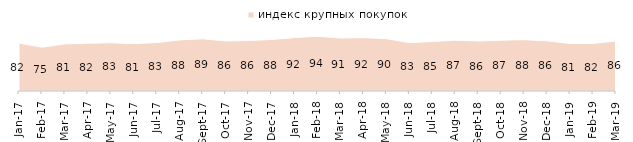
| Category | индекс крупных покупок |
|---|---|
| 2017-01-01 | 82.1 |
| 2017-02-01 | 75.05 |
| 2017-03-01 | 80.8 |
| 2017-04-01 | 81.9 |
| 2017-05-01 | 82.65 |
| 2017-06-01 | 81.15 |
| 2017-07-01 | 82.95 |
| 2017-08-01 | 87.6 |
| 2017-09-01 | 89.45 |
| 2017-10-01 | 85.75 |
| 2017-11-01 | 86.45 |
| 2017-12-01 | 88.3 |
| 2018-01-01 | 91.55 |
| 2018-02-01 | 93.75 |
| 2018-03-01 | 90.85 |
| 2018-04-01 | 91.5 |
| 2018-05-01 | 89.75 |
| 2018-06-01 | 82.95 |
| 2018-07-01 | 84.7 |
| 2018-08-01 | 87.05 |
| 2018-09-01 | 85.65 |
| 2018-10-01 | 87.15 |
| 2018-11-01 | 87.974 |
| 2018-12-01 | 85.95 |
| 2019-01-01 | 81.45 |
| 2019-02-01 | 81.55 |
| 2019-03-01 | 85.828 |